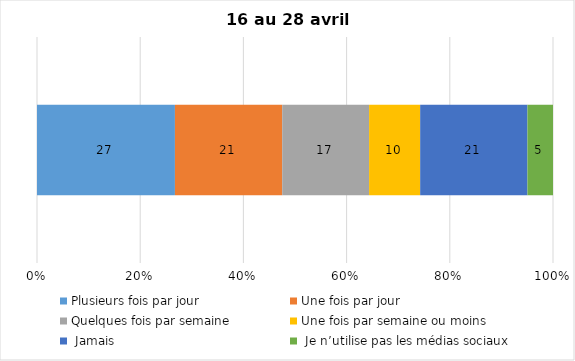
| Category | Plusieurs fois par jour | Une fois par jour | Quelques fois par semaine   | Une fois par semaine ou moins   |  Jamais   |  Je n’utilise pas les médias sociaux |
|---|---|---|---|---|---|---|
| 0 | 27 | 21 | 17 | 10 | 21 | 5 |